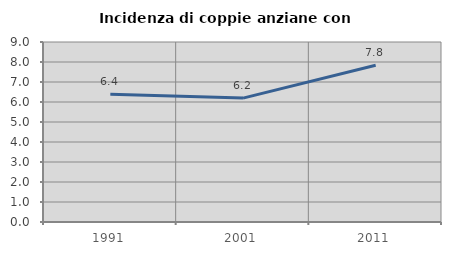
| Category | Incidenza di coppie anziane con figli |
|---|---|
| 1991.0 | 6.383 |
| 2001.0 | 6.195 |
| 2011.0 | 7.834 |